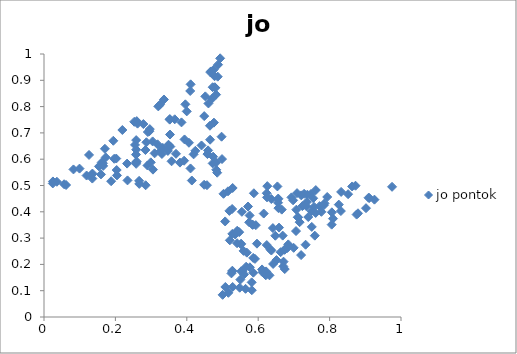
| Category | jo pontok |
|---|---|
| 0.4190880848255827 | 0.618 |
| 0.8795389242694485 | 0.394 |
| -1.0 | 0 |
| -1.0 | 0 |
| -1.0 | 0 |
| 0.20234553329893412 | 0.603 |
| -1.0 | 0 |
| -1.0 | 0 |
| -1.0 | 0 |
| -1.0 | 0 |
| -1.0 | 0 |
| 0.5965256334236526 | 0.279 |
| -1.0 | 0 |
| -1.0 | 0 |
| -1.0 | 0 |
| -1.0 | 0 |
| 0.4737132848312975 | 0.61 |
| 0.5513066870022572 | 0.277 |
| -1.0 | 0 |
| -1.0 | 0 |
| -1.0 | 0 |
| 0.309826779243374 | 0.622 |
| 0.2908770680687027 | 0.703 |
| -1.0 | 0 |
| 0.1706412247905167 | 0.64 |
| -1.0 | 0 |
| -1.0 | 0 |
| 0.15959633864781075 | 0.542 |
| -1.0 | 0 |
| -1.0 | 0 |
| -1.0 | 0 |
| 0.6368632486154109 | 0.253 |
| -1.0 | 0 |
| -1.0 | 0 |
| -1.0 | 0 |
| -1.0 | 0 |
| -1.0 | 0 |
| -1.0 | 0 |
| -1.0 | 0 |
| -1.0 | 0 |
| -1.0 | 0 |
| -1.0 | 0 |
| -1.0 | 0 |
| -1.0 | 0 |
| -1.0 | 0 |
| -1.0 | 0 |
| -1.0 | 0 |
| -1.0 | 0 |
| -1.0 | 0 |
| -1.0 | 0 |
| -1.0 | 0 |
| 0.48758441879877923 | 0.959 |
| -1.0 | 0 |
| 0.5759164820947777 | 0.386 |
| -1.0 | 0 |
| -1.0 | 0 |
| -1.0 | 0 |
| -1.0 | 0 |
| -1.0 | 0 |
| -1.0 | 0 |
| -1.0 | 0 |
| -1.0 | 0 |
| -1.0 | 0 |
| -1.0 | 0 |
| -1.0 | 0 |
| -1.0 | 0 |
| -1.0 | 0 |
| 0.7201938125930001 | 0.235 |
| 0.6555602974690267 | 0.448 |
| -1.0 | 0 |
| -1.0 | 0 |
| -1.0 | 0 |
| -1.0 | 0 |
| -1.0 | 0 |
| -1.0 | 0 |
| -1.0 | 0 |
| -1.0 | 0 |
| -1.0 | 0 |
| 0.3360162800699724 | 0.827 |
| -1.0 | 0 |
| -1.0 | 0 |
| -1.0 | 0 |
| -1.0 | 0 |
| 0.5933570302621523 | 0.349 |
| -1.0 | 0 |
| 0.5845289933988573 | 0.35 |
| -1.0 | 0 |
| 0.5353283273337004 | 0.314 |
| -1.0 | 0 |
| -1.0 | 0 |
| -1.0 | 0 |
| -1.0 | 0 |
| -1.0 | 0 |
| -1.0 | 0 |
| -1.0 | 0 |
| -1.0 | 0 |
| -1.0 | 0 |
| -1.0 | 0 |
| -1.0 | 0 |
| -1.0 | 0 |
| -1.0 | 0 |
| -1.0 | 0 |
| -1.0 | 0 |
| -1.0 | 0 |
| -1.0 | 0 |
| -1.0 | 0 |
| -1.0 | 0 |
| -1.0 | 0 |
| -1.0 | 0 |
| -1.0 | 0 |
| -1.0 | 0 |
| 0.25500629500599303 | 0.654 |
| -1.0 | 0 |
| -1.0 | 0 |
| -1.0 | 0 |
| -1.0 | 0 |
| 0.5003676095944769 | 0.084 |
| -1.0 | 0 |
| 0.2841294572864408 | 0.635 |
| -1.0 | 0 |
| -1.0 | 0 |
| -1.0 | 0 |
| -1.0 | 0 |
| 0.6222413600602537 | 0.173 |
| -1.0 | 0 |
| -1.0 | 0 |
| -1.0 | 0 |
| 0.548223590863872 | 0.111 |
| -1.0 | 0 |
| -1.0 | 0 |
| 0.46721138109302096 | 0.934 |
| -1.0 | 0 |
| -1.0 | 0 |
| -1.0 | 0 |
| -1.0 | 0 |
| -1.0 | 0 |
| -1.0 | 0 |
| -1.0 | 0 |
| -1.0 | 0 |
| 0.2598461429960901 | 0.745 |
| 0.024655074485529838 | 0.508 |
| -1.0 | 0 |
| 0.4934778974852225 | 0.984 |
| -1.0 | 0 |
| 0.6240457974850981 | 0.274 |
| -1.0 | 0 |
| -1.0 | 0 |
| -1.0 | 0 |
| -1.0 | 0 |
| 0.9111800021316641 | 0.452 |
| -1.0 | 0 |
| -1.0 | 0 |
| 0.23389996721357154 | 0.519 |
| -1.0 | 0 |
| -1.0 | 0 |
| 0.9256165139185424 | 0.446 |
| -1.0 | 0 |
| -1.0 | 0 |
| 0.4564301917216449 | 0.501 |
| 0.30519939763365045 | 0.56 |
| 0.23277667455020468 | 0.583 |
| 0.4706057559728014 | 0.83 |
| 0.5590790275262094 | 0.251 |
| 0.1261386451262494 | 0.616 |
| -1.0 | 0 |
| -1.0 | 0 |
| -1.0 | 0 |
| -1.0 | 0 |
| -1.0 | 0 |
| -1.0 | 0 |
| -1.0 | 0 |
| -1.0 | 0 |
| -1.0 | 0 |
| -1.0 | 0 |
| 0.8322898761341548 | 0.476 |
| -1.0 | 0 |
| -1.0 | 0 |
| 0.7059678221366426 | 0.327 |
| -1.0 | 0 |
| 0.7359748605292058 | 0.437 |
| 0.805800696885318 | 0.351 |
| -1.0 | 0 |
| -1.0 | 0 |
| 0.4819782742354102 | 0.587 |
| -1.0 | 0 |
| -1.0 | 0 |
| -1.0 | 0 |
| -1.0 | 0 |
| -1.0 | 0 |
| -1.0 | 0 |
| -1.0 | 0 |
| -1.0 | 0 |
| -1.0 | 0 |
| -1.0 | 0 |
| -1.0 | 0 |
| 0.2194712524394573 | 0.711 |
| -1.0 | 0 |
| -1.0 | 0 |
| -1.0 | 0 |
| -1.0 | 0 |
| 0.13589423022433533 | 0.545 |
| -1.0 | 0 |
| -1.0 | 0 |
| -1.0 | 0 |
| -1.0 | 0 |
| -1.0 | 0 |
| -1.0 | 0 |
| -1.0 | 0 |
| -1.0 | 0 |
| 0.7206901963840393 | 0.463 |
| 0.7352559481127803 | 0.421 |
| -1.0 | 0 |
| -1.0 | 0 |
| -1.0 | 0 |
| 0.4784797496642179 | 0.874 |
| -1.0 | 0 |
| -1.0 | 0 |
| -1.0 | 0 |
| -1.0 | 0 |
| -1.0 | 0 |
| -1.0 | 0 |
| -1.0 | 0 |
| -1.0 | 0 |
| 0.2847171549024381 | 0.501 |
| -1.0 | 0 |
| 0.7613609842578528 | 0.483 |
| 0.6512576817240365 | 0.217 |
| -1.0 | 0 |
| -1.0 | 0 |
| 0.7068445758133923 | 0.408 |
| -1.0 | 0 |
| -1.0 | 0 |
| -1.0 | 0 |
| 0.564605826395356 | 0.107 |
| -1.0 | 0 |
| -1.0 | 0 |
| 0.25801910564208885 | 0.588 |
| -1.0 | 0 |
| -1.0 | 0 |
| -1.0 | 0 |
| -1.0 | 0 |
| -1.0 | 0 |
| -1.0 | 0 |
| -1.0 | 0 |
| -1.0 | 0 |
| -1.0 | 0 |
| 0.46485687491255234 | 0.727 |
| -1.0 | 0 |
| -1.0 | 0 |
| -1.0 | 0 |
| -1.0 | 0 |
| 0.39594005545665034 | 0.809 |
| -1.0 | 0 |
| -1.0 | 0 |
| -1.0 | 0 |
| -1.0 | 0 |
| -1.0 | 0 |
| -1.0 | 0 |
| -1.0 | 0 |
| -1.0 | 0 |
| 0.45780164130454826 | 0.62 |
| -1.0 | 0 |
| -1.0 | 0 |
| -1.0 | 0 |
| -1.0 | 0 |
| -1.0 | 0 |
| -1.0 | 0 |
| 0.8257966696650298 | 0.427 |
| -1.0 | 0 |
| -1.0 | 0 |
| -1.0 | 0 |
| 0.7720788977308706 | 0.422 |
| 0.566248378757761 | 0.191 |
| 0.25280582672387997 | 0.742 |
| -1.0 | 0 |
| -1.0 | 0 |
| -1.0 | 0 |
| 0.7585461237906337 | 0.309 |
| -1.0 | 0 |
| -1.0 | 0 |
| 0.3260887488956463 | 0.63 |
| -1.0 | 0 |
| -1.0 | 0 |
| -1.0 | 0 |
| 0.658344524773347 | 0.34 |
| -1.0 | 0 |
| -1.0 | 0 |
| -1.0 | 0 |
| -1.0 | 0 |
| -1.0 | 0 |
| -1.0 | 0 |
| -1.0 | 0 |
| -1.0 | 0 |
| -1.0 | 0 |
| -1.0 | 0 |
| -1.0 | 0 |
| -1.0 | 0 |
| -1.0 | 0 |
| 0.5275847369318742 | 0.176 |
| -1.0 | 0 |
| -1.0 | 0 |
| 0.4724718682326152 | 0.584 |
| -1.0 | 0 |
| -1.0 | 0 |
| -1.0 | 0 |
| -1.0 | 0 |
| -1.0 | 0 |
| -1.0 | 0 |
| 0.11929806458731296 | 0.538 |
| -1.0 | 0 |
| -1.0 | 0 |
| -1.0 | 0 |
| -1.0 | 0 |
| -1.0 | 0 |
| -1.0 | 0 |
| -1.0 | 0 |
| -1.0 | 0 |
| -1.0 | 0 |
| -1.0 | 0 |
| -1.0 | 0 |
| -1.0 | 0 |
| 0.4519005726157266 | 0.839 |
| 0.4060566998783113 | 0.662 |
| -1.0 | 0 |
| -1.0 | 0 |
| 0.7236696052673208 | 0.422 |
| -1.0 | 0 |
| -1.0 | 0 |
| -1.0 | 0 |
| 0.7541086220247153 | 0.451 |
| -1.0 | 0 |
| -1.0 | 0 |
| -1.0 | 0 |
| -1.0 | 0 |
| -1.0 | 0 |
| -1.0 | 0 |
| -1.0 | 0 |
| -1.0 | 0 |
| -1.0 | 0 |
| -1.0 | 0 |
| -1.0 | 0 |
| -1.0 | 0 |
| -1.0 | 0 |
| 0.025060292392043326 | 0.515 |
| -1.0 | 0 |
| -1.0 | 0 |
| 0.35298006165119045 | 0.694 |
| -1.0 | 0 |
| -1.0 | 0 |
| 0.5074755392789063 | 0.363 |
| -1.0 | 0 |
| -1.0 | 0 |
| -1.0 | 0 |
| -1.0 | 0 |
| -1.0 | 0 |
| -1.0 | 0 |
| 0.740200278143285 | 0.38 |
| -1.0 | 0 |
| 0.6743557297769456 | 0.182 |
| -1.0 | 0 |
| -1.0 | 0 |
| 0.6478965662915419 | 0.309 |
| -1.0 | 0 |
| 0.35242568626740933 | 0.753 |
| -1.0 | 0 |
| 0.8726089391901244 | 0.499 |
| -1.0 | 0 |
| -1.0 | 0 |
| 0.18812380363515224 | 0.516 |
| -1.0 | 0 |
| -1.0 | 0 |
| -1.0 | 0 |
| -1.0 | 0 |
| -1.0 | 0 |
| 0.7377743321641284 | 0.465 |
| -1.0 | 0 |
| -1.0 | 0 |
| 0.19412094806923275 | 0.67 |
| -1.0 | 0 |
| -1.0 | 0 |
| -1.0 | 0 |
| -1.0 | 0 |
| -1.0 | 0 |
| -1.0 | 0 |
| -1.0 | 0 |
| -1.0 | 0 |
| -1.0 | 0 |
| -1.0 | 0 |
| -1.0 | 0 |
| -1.0 | 0 |
| 0.5205446444593687 | 0.292 |
| -1.0 | 0 |
| -1.0 | 0 |
| 0.6212374656855548 | 0.159 |
| -1.0 | 0 |
| 0.47592304068600155 | 0.739 |
| 0.875690236873006 | 0.389 |
| -1.0 | 0 |
| 0.684221090379495 | 0.276 |
| -1.0 | 0 |
| 0.7610028812011456 | 0.396 |
| -1.0 | 0 |
| -1.0 | 0 |
| -1.0 | 0 |
| -1.0 | 0 |
| -1.0 | 0 |
| -1.0 | 0 |
| -1.0 | 0 |
| -1.0 | 0 |
| -1.0 | 0 |
| -1.0 | 0 |
| -1.0 | 0 |
| 0.6154781515420362 | 0.393 |
| -1.0 | 0 |
| -1.0 | 0 |
| -1.0 | 0 |
| -1.0 | 0 |
| 0.2963530259865115 | 0.714 |
| -1.0 | 0 |
| -1.0 | 0 |
| -1.0 | 0 |
| 0.6254336231393336 | 0.498 |
| -1.0 | 0 |
| -1.0 | 0 |
| 0.20364675801008314 | 0.559 |
| -1.0 | 0 |
| -1.0 | 0 |
| -1.0 | 0 |
| -1.0 | 0 |
| -1.0 | 0 |
| -1.0 | 0 |
| -1.0 | 0 |
| -1.0 | 0 |
| 0.4412428186654265 | 0.652 |
| 0.2595286306132587 | 0.591 |
| -1.0 | 0 |
| 0.16572767614020467 | 0.574 |
| -1.0 | 0 |
| 0.5816819379260627 | 0.132 |
| -1.0 | 0 |
| -1.0 | 0 |
| -1.0 | 0 |
| -1.0 | 0 |
| -1.0 | 0 |
| -1.0 | 0 |
| -1.0 | 0 |
| 0.056314175909767394 | 0.505 |
| -1.0 | 0 |
| 0.4974164849236713 | 0.686 |
| -1.0 | 0 |
| -1.0 | 0 |
| -1.0 | 0 |
| -1.0 | 0 |
| -1.0 | 0 |
| -1.0 | 0 |
| -1.0 | 0 |
| -1.0 | 0 |
| -1.0 | 0 |
| -1.0 | 0 |
| -1.0 | 0 |
| 0.5500659554435003 | 0.142 |
| 0.7476646318559574 | 0.467 |
| -1.0 | 0 |
| 0.36616757402607814 | 0.752 |
| -1.0 | 0 |
| -1.0 | 0 |
| 0.7286681493525018 | 0.468 |
| -1.0 | 0 |
| -1.0 | 0 |
| -1.0 | 0 |
| -1.0 | 0 |
| -1.0 | 0 |
| -1.0 | 0 |
| 0.5821054262321348 | 0.102 |
| -1.0 | 0 |
| -1.0 | 0 |
| -1.0 | 0 |
| -1.0 | 0 |
| -1.0 | 0 |
| -1.0 | 0 |
| -1.0 | 0 |
| -1.0 | 0 |
| -1.0 | 0 |
| -1.0 | 0 |
| -1.0 | 0 |
| 0.6121998788260079 | 0.17 |
| -1.0 | 0 |
| -1.0 | 0 |
| -1.0 | 0 |
| -1.0 | 0 |
| -1.0 | 0 |
| -1.0 | 0 |
| -1.0 | 0 |
| -1.0 | 0 |
| -1.0 | 0 |
| 0.6344803130530263 | 0.257 |
| -1.0 | 0 |
| -1.0 | 0 |
| -1.0 | 0 |
| -1.0 | 0 |
| -1.0 | 0 |
| 0.5557120131176867 | 0.174 |
| -1.0 | 0 |
| 0.30433650089288933 | 0.668 |
| 0.3303417796022825 | 0.62 |
| -1.0 | 0 |
| -1.0 | 0 |
| -1.0 | 0 |
| -1.0 | 0 |
| 0.9749740452746023 | 0.495 |
| -1.0 | 0 |
| -1.0 | 0 |
| -1.0 | 0 |
| 0.6538391571041084 | 0.496 |
| 0.26205202209375233 | 0.735 |
| -1.0 | 0 |
| -1.0 | 0 |
| 0.6659857587530436 | 0.408 |
| -1.0 | 0 |
| -1.0 | 0 |
| -1.0 | 0 |
| -1.0 | 0 |
| -1.0 | 0 |
| 0.5277548475689908 | 0.174 |
| -1.0 | 0 |
| -1.0 | 0 |
| 0.6931192374108532 | 0.455 |
| -1.0 | 0 |
| 0.35204086721299443 | 0.75 |
| -1.0 | 0 |
| -1.0 | 0 |
| -1.0 | 0 |
| -1.0 | 0 |
| -1.0 | 0 |
| -1.0 | 0 |
| -1.0 | 0 |
| -1.0 | 0 |
| 0.631683895093244 | 0.159 |
| -1.0 | 0 |
| -1.0 | 0 |
| -1.0 | 0 |
| -1.0 | 0 |
| 0.5270374828220508 | 0.411 |
| 0.20436640626523062 | 0.538 |
| 0.35735626411234755 | 0.592 |
| -1.0 | 0 |
| 0.2664692975752249 | 0.518 |
| 0.576724262163905 | 0.189 |
| -1.0 | 0 |
| -1.0 | 0 |
| -1.0 | 0 |
| -1.0 | 0 |
| 0.34698075744322554 | 0.631 |
| -1.0 | 0 |
| -1.0 | 0 |
| -1.0 | 0 |
| -1.0 | 0 |
| -1.0 | 0 |
| 0.6703016278588128 | 0.193 |
| -1.0 | 0 |
| -1.0 | 0 |
| 0.48201761587320346 | 0.845 |
| -1.0 | 0 |
| -1.0 | 0 |
| -1.0 | 0 |
| -1.0 | 0 |
| 0.5747172816170032 | 0.36 |
| -1.0 | 0 |
| -1.0 | 0 |
| 0.17289159154794653 | 0.607 |
| -1.0 | 0 |
| 0.6709769052700842 | 0.21 |
| -1.0 | 0 |
| -1.0 | 0 |
| -1.0 | 0 |
| -1.0 | 0 |
| -1.0 | 0 |
| -1.0 | 0 |
| -1.0 | 0 |
| 0.8315829954154959 | 0.403 |
| -1.0 | 0 |
| 0.38513667239420624 | 0.74 |
| -1.0 | 0 |
| -1.0 | 0 |
| -1.0 | 0 |
| -1.0 | 0 |
| 0.7840822219635397 | 0.425 |
| -1.0 | 0 |
| -1.0 | 0 |
| -1.0 | 0 |
| -1.0 | 0 |
| -1.0 | 0 |
| -1.0 | 0 |
| -1.0 | 0 |
| 0.6239489635875559 | 0.471 |
| 0.32513629145031 | 0.808 |
| 0.5028711744621841 | 0.468 |
| -1.0 | 0 |
| 0.5878795891686168 | 0.47 |
| -1.0 | 0 |
| -1.0 | 0 |
| -1.0 | 0 |
| -1.0 | 0 |
| -1.0 | 0 |
| -1.0 | 0 |
| -1.0 | 0 |
| 0.4824886231552967 | 0.56 |
| 0.5860176732883104 | 0.225 |
| -1.0 | 0 |
| -1.0 | 0 |
| 0.5542448577632566 | 0.4 |
| -1.0 | 0 |
| -1.0 | 0 |
| -1.0 | 0 |
| -1.0 | 0 |
| 0.47250090251176746 | 0.874 |
| 0.2668347496773995 | 0.506 |
| 0.392411333438238 | 0.594 |
| -1.0 | 0 |
| -1.0 | 0 |
| -1.0 | 0 |
| 0.750110802684572 | 0.343 |
| -1.0 | 0 |
| -1.0 | 0 |
| -1.0 | 0 |
| 0.25814577823917784 | 0.673 |
| -1.0 | 0 |
| -1.0 | 0 |
| -1.0 | 0 |
| -1.0 | 0 |
| -1.0 | 0 |
| -1.0 | 0 |
| -1.0 | 0 |
| -1.0 | 0 |
| -1.0 | 0 |
| -1.0 | 0 |
| -1.0 | 0 |
| -1.0 | 0 |
| 0.5839455970589911 | 0.352 |
| -1.0 | 0 |
| 0.3808393181212715 | 0.587 |
| -1.0 | 0 |
| -1.0 | 0 |
| -1.0 | 0 |
| -1.0 | 0 |
| 0.5715578232406213 | 0.42 |
| -1.0 | 0 |
| -1.0 | 0 |
| -1.0 | 0 |
| -1.0 | 0 |
| 0.3327527872682996 | 0.643 |
| 0.8094801930750224 | 0.374 |
| -1.0 | 0 |
| -1.0 | 0 |
| -1.0 | 0 |
| 0.25816156333803364 | 0.582 |
| -1.0 | 0 |
| -1.0 | 0 |
| -1.0 | 0 |
| -1.0 | 0 |
| -1.0 | 0 |
| 0.7933554211477993 | 0.456 |
| 0.6246943712714608 | 0.455 |
| -1.0 | 0 |
| -1.0 | 0 |
| 0.09951311114566774 | 0.564 |
| -1.0 | 0 |
| -1.0 | 0 |
| -1.0 | 0 |
| -1.0 | 0 |
| -1.0 | 0 |
| -1.0 | 0 |
| -1.0 | 0 |
| -1.0 | 0 |
| -1.0 | 0 |
| -1.0 | 0 |
| -1.0 | 0 |
| -1.0 | 0 |
| 0.9019398015817561 | 0.414 |
| -1.0 | 0 |
| -1.0 | 0 |
| -1.0 | 0 |
| -1.0 | 0 |
| -1.0 | 0 |
| -1.0 | 0 |
| -1.0 | 0 |
| 0.16514461990735496 | 0.585 |
| -1.0 | 0 |
| 0.5407478098853404 | 0.281 |
| -1.0 | 0 |
| 0.46060995566058094 | 0.812 |
| -1.0 | 0 |
| 0.6977646573843304 | 0.444 |
| -1.0 | 0 |
| -1.0 | 0 |
| 0.8631682778693754 | 0.496 |
| 0.5163945796403278 | 0.092 |
| -1.0 | 0 |
| -1.0 | 0 |
| -1.0 | 0 |
| -1.0 | 0 |
| -1.0 | 0 |
| -1.0 | 0 |
| -1.0 | 0 |
| -1.0 | 0 |
| 0.4799599758931752 | 0.871 |
| -1.0 | 0 |
| 0.29910657477351377 | 0.588 |
| 0.5863742311222788 | 0.169 |
| -1.0 | 0 |
| 0.50792818892341 | 0.114 |
| -1.0 | 0 |
| 0.399860313131162 | 0.782 |
| 0.6748014251307612 | 0.257 |
| 0.777057400105325 | 0.4 |
| -1.0 | 0 |
| -1.0 | 0 |
| -1.0 | 0 |
| 0.3697101763184385 | 0.62 |
| -1.0 | 0 |
| -1.0 | 0 |
| -1.0 | 0 |
| -1.0 | 0 |
| -1.0 | 0 |
| -1.0 | 0 |
| 0.16160418749318062 | 0.588 |
| -1.0 | 0 |
| -1.0 | 0 |
| -1.0 | 0 |
| 0.25828779956673853 | 0.636 |
| 0.5468171693422326 | 0.323 |
| -1.0 | 0 |
| 0.5522588889137201 | 0.278 |
| 0.03607519880615362 | 0.514 |
| -1.0 | 0 |
| -1.0 | 0 |
| -1.0 | 0 |
| 0.41074791560079404 | 0.885 |
| -1.0 | 0 |
| -1.0 | 0 |
| -1.0 | 0 |
| 0.46526573643401914 | 0.674 |
| -1.0 | 0 |
| -1.0 | 0 |
| -1.0 | 0 |
| -1.0 | 0 |
| 0.48511942796386087 | 0.549 |
| 0.5153938198932666 | 0.478 |
| -1.0 | 0 |
| -1.0 | 0 |
| -1.0 | 0 |
| -1.0 | 0 |
| -1.0 | 0 |
| -1.0 | 0 |
| -1.0 | 0 |
| -1.0 | 0 |
| -1.0 | 0 |
| 0.46654915220748894 | 0.93 |
| 0.3486961382434224 | 0.655 |
| 0.7496402604133001 | 0.402 |
| -1.0 | 0 |
| 0.1539703284551035 | 0.573 |
| 0.4104112119133627 | 0.565 |
| -1.0 | 0 |
| -1.0 | 0 |
| 0.6686158202717309 | 0.309 |
| 0.5909847399326364 | 0.221 |
| -1.0 | 0 |
| -1.0 | 0 |
| 0.7111736380147962 | 0.379 |
| -1.0 | 0 |
| -1.0 | 0 |
| -1.0 | 0 |
| 0.2783986619960004 | 0.734 |
| -1.0 | 0 |
| -1.0 | 0 |
| -1.0 | 0 |
| -1.0 | 0 |
| -1.0 | 0 |
| -1.0 | 0 |
| -1.0 | 0 |
| 0.4095786945526747 | 0.859 |
| -1.0 | 0 |
| -1.0 | 0 |
| 0.6994018506944724 | 0.263 |
| -1.0 | 0 |
| -1.0 | 0 |
| -1.0 | 0 |
| -1.0 | 0 |
| -1.0 | 0 |
| 0.08250485260856699 | 0.561 |
| -1.0 | 0 |
| 0.6417553344983056 | 0.202 |
| -1.0 | 0 |
| -1.0 | 0 |
| -1.0 | 0 |
| -1.0 | 0 |
| -1.0 | 0 |
| -1.0 | 0 |
| 0.6555011406521016 | 0.434 |
| -1.0 | 0 |
| -1.0 | 0 |
| -1.0 | 0 |
| -1.0 | 0 |
| -1.0 | 0 |
| -1.0 | 0 |
| -1.0 | 0 |
| 0.5275152186712484 | 0.316 |
| 0.6108162875164922 | 0.181 |
| -1.0 | 0 |
| -1.0 | 0 |
| -1.0 | 0 |
| -1.0 | 0 |
| -1.0 | 0 |
| -1.0 | 0 |
| -1.0 | 0 |
| -1.0 | 0 |
| -1.0 | 0 |
| -1.0 | 0 |
| -1.0 | 0 |
| -1.0 | 0 |
| -1.0 | 0 |
| -1.0 | 0 |
| 0.6736644305888901 | 0.255 |
| 0.5521467643969489 | 0.174 |
| -1.0 | 0 |
| -1.0 | 0 |
| -1.0 | 0 |
| -1.0 | 0 |
| 0.19664287565514038 | 0.602 |
| -1.0 | 0 |
| -1.0 | 0 |
| -1.0 | 0 |
| 0.5284689265552016 | 0.491 |
| -1.0 | 0 |
| -1.0 | 0 |
| -1.0 | 0 |
| 0.13535642358625388 | 0.526 |
| -1.0 | 0 |
| -1.0 | 0 |
| -1.0 | 0 |
| -1.0 | 0 |
| -1.0 | 0 |
| -1.0 | 0 |
| 0.6565525133047445 | 0.414 |
| -1.0 | 0 |
| -1.0 | 0 |
| -1.0 | 0 |
| -1.0 | 0 |
| -1.0 | 0 |
| 0.4596059410221871 | 0.634 |
| -1.0 | 0 |
| -1.0 | 0 |
| -1.0 | 0 |
| -1.0 | 0 |
| 0.4140618945904455 | 0.519 |
| -1.0 | 0 |
| -1.0 | 0 |
| -1.0 | 0 |
| -1.0 | 0 |
| -1.0 | 0 |
| -1.0 | 0 |
| -1.0 | 0 |
| 0.2868742387028218 | 0.664 |
| 0.48664168487148274 | 0.914 |
| -1.0 | 0 |
| 0.6367459924751393 | 0.449 |
| -1.0 | 0 |
| -1.0 | 0 |
| -1.0 | 0 |
| 0.5605746670229366 | 0.162 |
| 0.25763001439232935 | 0.617 |
| -1.0 | 0 |
| -1.0 | 0 |
| 0.756495898527795 | 0.419 |
| -1.0 | 0 |
| -1.0 | 0 |
| 0.13424293413778177 | 0.543 |
| -1.0 | 0 |
| -1.0 | 0 |
| -1.0 | 0 |
| -1.0 | 0 |
| -1.0 | 0 |
| -1.0 | 0 |
| -1.0 | 0 |
| -1.0 | 0 |
| -1.0 | 0 |
| -1.0 | 0 |
| -1.0 | 0 |
| -1.0 | 0 |
| -1.0 | 0 |
| 0.6817002669930978 | 0.262 |
| -1.0 | 0 |
| 0.5249521269942792 | 0.166 |
| -1.0 | 0 |
| 0.44858273166417906 | 0.503 |
| -1.0 | 0 |
| -1.0 | 0 |
| -1.0 | 0 |
| 0.5192284557204094 | 0.403 |
| -1.0 | 0 |
| -1.0 | 0 |
| -1.0 | 0 |
| -1.0 | 0 |
| -1.0 | 0 |
| 0.2898781954734242 | 0.576 |
| -1.0 | 0 |
| -1.0 | 0 |
| -1.0 | 0 |
| 0.6411856123510455 | 0.338 |
| -1.0 | 0 |
| 0.785834891072251 | 0.432 |
| -1.0 | 0 |
| -1.0 | 0 |
| -1.0 | 0 |
| -1.0 | 0 |
| -1.0 | 0 |
| -1.0 | 0 |
| -1.0 | 0 |
| -1.0 | 0 |
| -1.0 | 0 |
| 0.8063501613151036 | 0.398 |
| -1.0 | 0 |
| -1.0 | 0 |
| -1.0 | 0 |
| 0.4986435792487296 | 0.601 |
| -1.0 | 0 |
| -1.0 | 0 |
| 0.7114388902250266 | 0.38 |
| -1.0 | 0 |
| 0.7327886666766106 | 0.275 |
| 0.3936452001575286 | 0.675 |
| -1.0 | 0 |
| 0.5412657263964713 | 0.328 |
| -1.0 | 0 |
| -1.0 | 0 |
| -1.0 | 0 |
| 0.4238951589709776 | 0.632 |
| -1.0 | 0 |
| 0.2953398388496862 | 0.706 |
| -1.0 | 0 |
| -1.0 | 0 |
| -1.0 | 0 |
| 0.35393630224369144 | 0.648 |
| -1.0 | 0 |
| 0.47779167337946093 | 0.915 |
| -1.0 | 0 |
| 0.31804572252271424 | 0.657 |
| -1.0 | 0 |
| 0.6628916980961084 | 0.246 |
| -1.0 | 0 |
| 0.7160420699741088 | 0.361 |
| -1.0 | 0 |
| -1.0 | 0 |
| -1.0 | 0 |
| -1.0 | 0 |
| -1.0 | 0 |
| -1.0 | 0 |
| 0.5681664889272922 | 0.245 |
| -1.0 | 0 |
| -1.0 | 0 |
| -1.0 | 0 |
| -1.0 | 0 |
| -1.0 | 0 |
| -1.0 | 0 |
| 0.9091161836210464 | 0.453 |
| -1.0 | 0 |
| -1.0 | 0 |
| -1.0 | 0 |
| -1.0 | 0 |
| 0.656295053492741 | 0.45 |
| -1.0 | 0 |
| -1.0 | 0 |
| -1.0 | 0 |
| -1.0 | 0 |
| -1.0 | 0 |
| 0.7088290155639627 | 0.471 |
| -1.0 | 0 |
| -1.0 | 0 |
| -1.0 | 0 |
| 0.8518732735705061 | 0.467 |
| -1.0 | 0 |
| -1.0 | 0 |
| -1.0 | 0 |
| -1.0 | 0 |
| -1.0 | 0 |
| -1.0 | 0 |
| -1.0 | 0 |
| 0.47540708156234235 | 0.941 |
| 0.52847930056436 | 0.114 |
| -1.0 | 0 |
| -1.0 | 0 |
| -1.0 | 0 |
| -1.0 | 0 |
| -1.0 | 0 |
| -1.0 | 0 |
| 0.32022732266060583 | 0.801 |
| -1.0 | 0 |
| 0.4488033081493308 | 0.764 |
| 0.06180289425473262 | 0.502 |